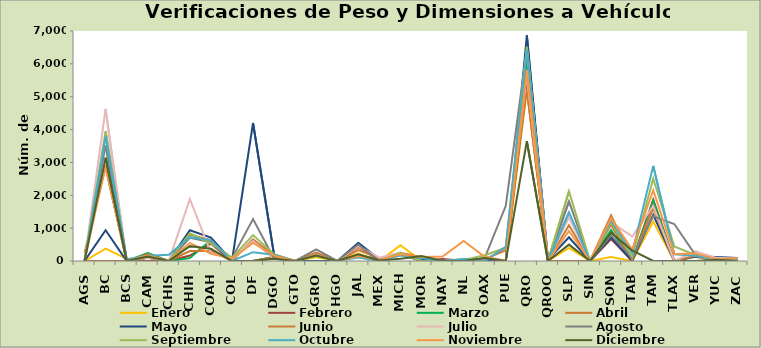
| Category | Enero | Febrero | Marzo | Abril | Mayo | Junio | Julio | Agosto | Septiembre | Octubre | Noviembre | Diciembre |
|---|---|---|---|---|---|---|---|---|---|---|---|---|
| AGS | 0 | 0 | 0 | 0 | 0 | 250 | 0 | 0 | 0 | 0 | 0 | 0 |
| BC | 379 | 0 | 0 | 0 | 937 | 2858 | 4626 | 3511 | 3949 | 3789 | 2913 | 3142 |
| BCS | 65 | 0 | 0 | 0 | 0 | 0 | 0 | 0 | 0 | 52 | 0 | 0 |
| CAM | 0 | 0 | 241 | 207 | 100 | 99 | 104 | 135 | 134 | 163 | 164 | 133 |
| CHIS | 0 | 0 | 0 | 0 | 0 | 0 | 0 | 0 | 0 | 191 | 0 | 0 |
| CHIH | 142 | 167 | 87 | 302 | 937 | 805 | 1880 | 706 | 842 | 728 | 553 | 452 |
| COAH | 576 | 528 | 637 | 306 | 712 | 633 | 251 | 571 | 534 | 637 | 222 | 371 |
| COL | 0 | 0 | 0 | 0 | 0 | 0 | 54 | 88 | 93 | 0 | 78 | 0 |
| DF | 0 | 0 | 0 | 0 | 4200 | 663 | 609 | 1278 | 788 | 269 | 550 | 0 |
| DGO | 73 | 120 | 120 | 110 | 178 | 176 | 70 | 70 | 206 | 193 | 163 | 72 |
| GTO | 0 | 0 | 0 | 0 | 0 | 0 | 0 | 0 | 0 | 0 | 0 | 0 |
| GRO | 113 | 0 | 0 | 0 | 0 | 255 | 170 | 353 | 154 | 182 | 180 | 169 |
| HGO | 0 | 0 | 0 | 0 | 0 | 0 | 0 | 0 | 0 | 0 | 0 | 0 |
| JAL | 228 | 168 | 497 | 422 | 556 | 331 | 458 | 500 | 172 | 105 | 150 | 203 |
| MEX | 0 | 53 | 0 | 18 | 53 | 79 | 99 | 0 | 0 | 0 | 25 | 14 |
| MICH | 480 | 215 | 240 | 251 | 203 | 202 | 254 | 207 | 250 | 170 | 205 | 72 |
| MOR | 0 | 0 | 93 | 118 | 49 | 0 | 0 | 0 | 0 | 92 | 120 | 155 |
| NAY | 0 | 59 | 0 | 0 | 0 | 0 | 0 | 0 | 0 | 0 | 138 | 0 |
| NL | 4 | 6 | 0 | 38 | 31 | 55 | 22 | 5 | 32 | 60 | 608 | 0 |
| OAX | 0 | 56 | 39 | 46 | 0 | 60 | 12 | 95 | 177 | 0 | 131 | 91 |
| PUE | 0 | 0 | 0 | 0 | 0 | 328 | 442 | 1678 | 406 | 431 | 5 | 0 |
| QRO | 5210 | 5434 | 6132 | 5802 | 6868 | 5239 | 5671 | 6439 | 6517 | 6427 | 5807 | 3646 |
| QROO | 0 | 0 | 0 | 0 | 41 | 0 | 0 | 0 | 0 | 0 | 0 | 0 |
| SLP | 399 | 0 | 0 | 0 | 720 | 1088 | 1329 | 1817 | 2127 | 1480 | 914 | 498 |
| SIN | 3 | 0 | 0 | 0 | 0 | 0 | 0 | 0 | 0 | 0 | 0 | 0 |
| SON | 123 | 671 | 943 | 1102 | 721 | 1387 | 1186 | 786 | 1164 | 1234 | 1299 | 860 |
| TAB | 0 | 0 | 0 | 0 | 0 | 30 | 740 | 100 | 130 | 244 | 350 | 320 |
| TAM | 1202 | 1870 | 1834 | 1679 | 1403 | 1601 | 1676 | 1362 | 2509 | 2895 | 2154 | 0 |
| TLAX | 0 | 0 | 0 | 0 | 0 | 3 | 0 | 1127 | 445 | 207 | 216 | 0 |
| VER | 0 | 0 | 0 | 132 | 138 | 162 | 291 | 189 | 184 | 161 | 231 | 0 |
| YUC | 0 | 0 | 0 | 0 | 120 | 45 | 96 | 2 | 0 | 35 | 50 | 41 |
| ZAC | 0 | 60 | 60 | 85 | 89 | 69 | 70 | 60 | 75 | 93 | 89 | 0 |